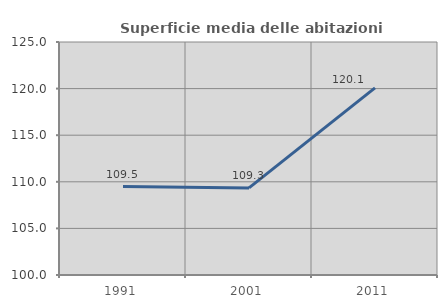
| Category | Superficie media delle abitazioni occupate |
|---|---|
| 1991.0 | 109.489 |
| 2001.0 | 109.342 |
| 2011.0 | 120.085 |